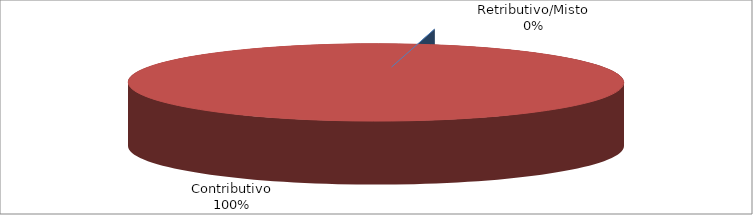
| Category | Decorrenti gennaio - settembre 2021 |
|---|---|
| Retributivo/Misto | 0 |
| Contributivo | 28393 |